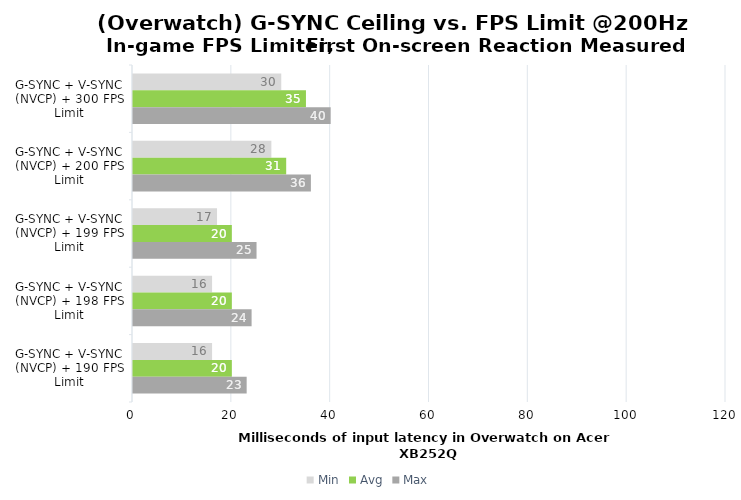
| Category | Min | Avg | Max |
|---|---|---|---|
| G-SYNC + V-SYNC (NVCP) + 300 FPS Limit | 30 | 35 | 40 |
| G-SYNC + V-SYNC (NVCP) + 200 FPS Limit | 28 | 31 | 36 |
| G-SYNC + V-SYNC (NVCP) + 199 FPS Limit | 17 | 20 | 25 |
| G-SYNC + V-SYNC (NVCP) + 198 FPS Limit | 16 | 20 | 24 |
| G-SYNC + V-SYNC (NVCP) + 190 FPS Limit | 16 | 20 | 23 |